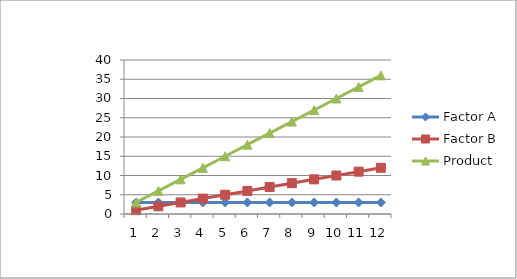
| Category | Factor A | Factor B | Product |
|---|---|---|---|
| 0 | 3 | 1 | 3 |
| 1 | 3 | 2 | 6 |
| 2 | 3 | 3 | 9 |
| 3 | 3 | 4 | 12 |
| 4 | 3 | 5 | 15 |
| 5 | 3 | 6 | 18 |
| 6 | 3 | 7 | 21 |
| 7 | 3 | 8 | 24 |
| 8 | 3 | 9 | 27 |
| 9 | 3 | 10 | 30 |
| 10 | 3 | 11 | 33 |
| 11 | 3 | 12 | 36 |